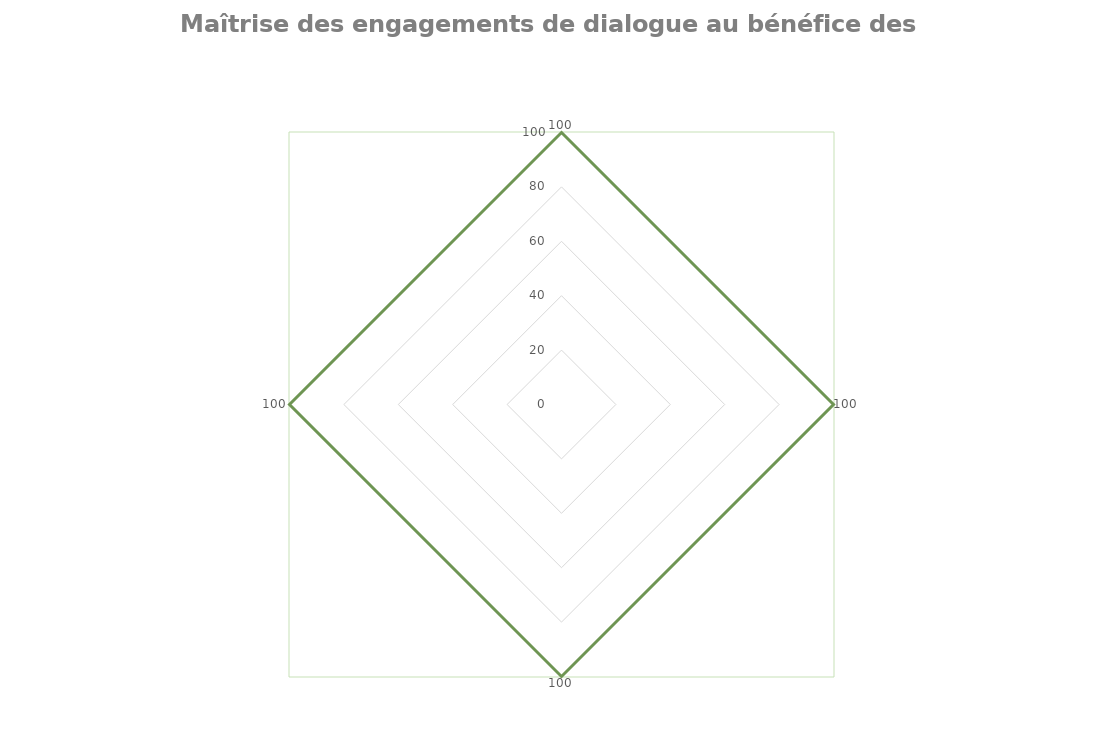
| Category | Series 1 | Series 3 |
|---|---|---|
| 0 |  | 100 |
| 1 |  | 100 |
| 2 |  | 100 |
| 3 |  | 100 |